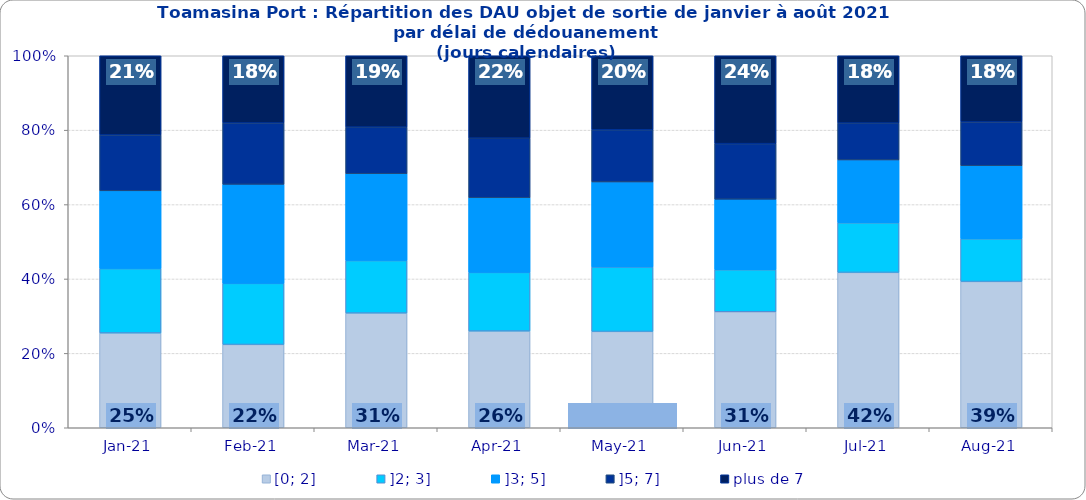
| Category | [0; 2] | ]2; 3] | ]3; 5] | ]5; 7] | plus de 7 |
|---|---|---|---|---|---|
| 2021-01-01 | 0.255 | 0.173 | 0.209 | 0.15 | 0.213 |
| 2021-02-01 | 0.224 | 0.164 | 0.266 | 0.165 | 0.181 |
| 2021-03-01 | 0.308 | 0.141 | 0.233 | 0.125 | 0.192 |
| 2021-04-01 | 0.26 | 0.158 | 0.201 | 0.16 | 0.221 |
| 2021-05-01 | 0.259 | 0.173 | 0.229 | 0.14 | 0.199 |
| 2021-06-01 | 0.312 | 0.113 | 0.19 | 0.149 | 0.236 |
| 2021-07-01 | 0.418 | 0.133 | 0.169 | 0.099 | 0.181 |
| 2021-08-01 | 0.393 | 0.115 | 0.196 | 0.118 | 0.178 |